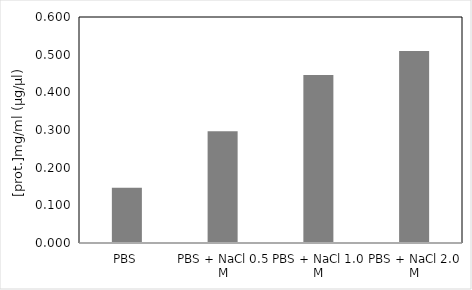
| Category | Series 0 |
|---|---|
| PBS | 0.146 |
| PBS + NaCl 0.5 M | 0.296 |
| PBS + NaCl 1.0 M | 0.446 |
| PBS + NaCl 2.0 M | 0.51 |